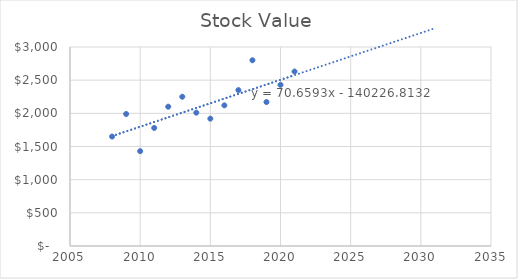
| Category | Stock Value |
|---|---|
| 2008.0 | 1650 |
| 2009.0 | 1990 |
| 2010.0 | 1430 |
| 2011.0 | 1780 |
| 2012.0 | 2100 |
| 2013.0 | 2250 |
| 2014.0 | 2010 |
| 2015.0 | 1920 |
| 2016.0 | 2120 |
| 2017.0 | 2350 |
| 2018.0 | 2800 |
| 2019.0 | 2170 |
| 2020.0 | 2430 |
| 2021.0 | 2630 |